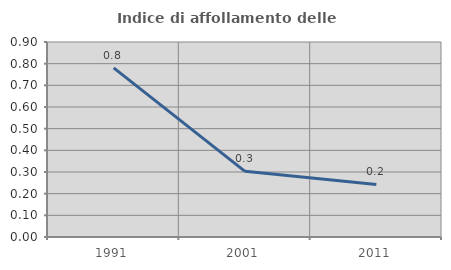
| Category | Indice di affollamento delle abitazioni  |
|---|---|
| 1991.0 | 0.78 |
| 2001.0 | 0.303 |
| 2011.0 | 0.242 |